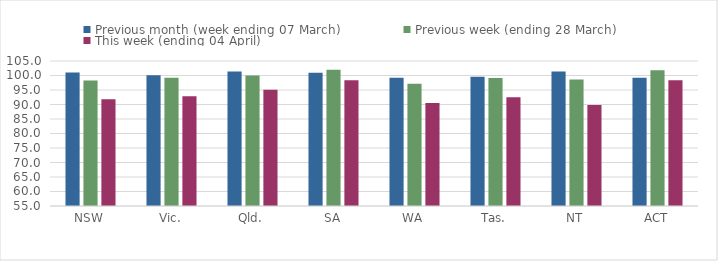
| Category | Previous month (week ending 07 March) | Previous week (ending 28 March) | This week (ending 04 April) |
|---|---|---|---|
| NSW | 101.048 | 98.245 | 91.783 |
| Vic. | 100.123 | 99.254 | 92.873 |
| Qld. | 101.354 | 99.976 | 95.047 |
| SA | 100.968 | 101.987 | 98.331 |
| WA | 99.26 | 97.114 | 90.535 |
| Tas. | 99.548 | 99.097 | 92.462 |
| NT | 101.342 | 98.591 | 89.799 |
| ACT | 99.243 | 101.835 | 98.396 |